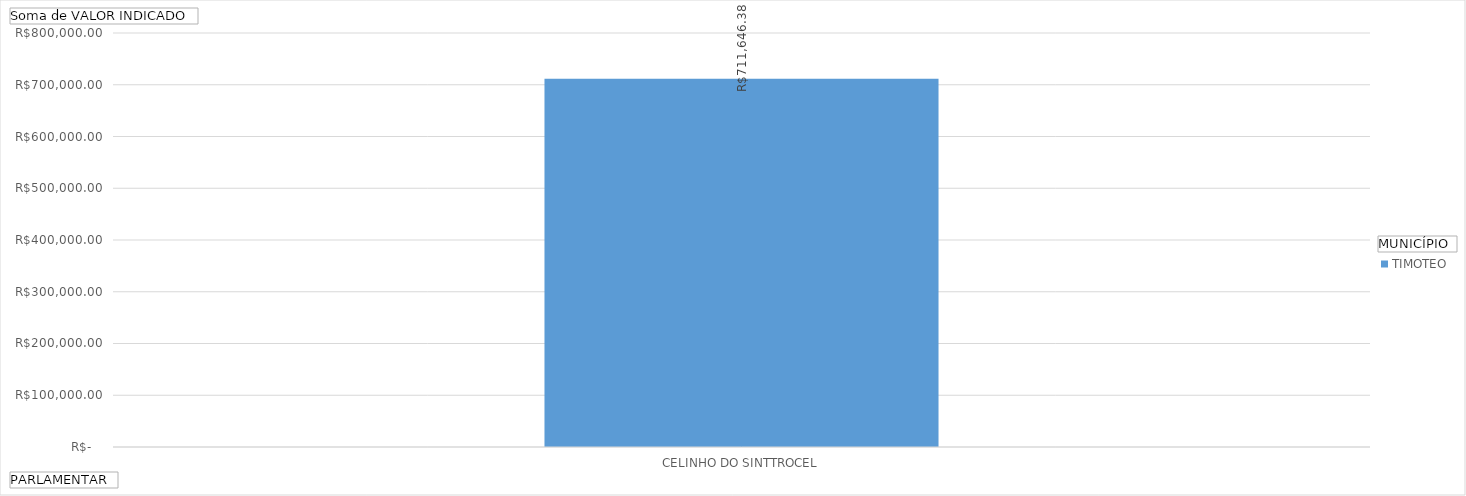
| Category | TIMOTEO |
|---|---|
| CELINHO DO SINTTROCEL | 711646.38 |